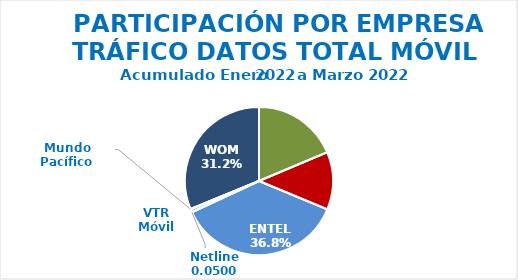
| Category | Series 0 |
|---|---|
| Movistar | 426535.199 |
| Claro | 288813.857 |
| ENTEL | 841948.229 |
| Netline | 0 |
| VTR Móvil | 15150.493 |
| Mundo Pacífico | 2249.264 |
| WOM | 713306.063 |